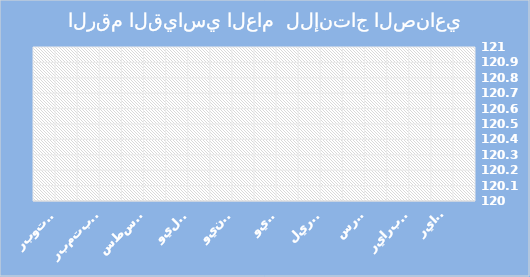
| Category | الرقم القياسي |
|---|---|
| 0 | 130.43 |
| 1 | 129.29 |
| 2 | 125.58 |
| 3 | 126.34 |
| 4 | 125.16 |
| 5 | 126.61 |
| 6 | 125.37 |
| 7 | 127.33 |
| 8 | 121.55 |
| 9 | 130.713 |